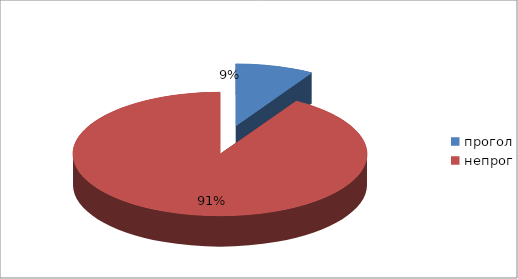
| Category | Series 0 |
|---|---|
| прогол | 36 |
| непрог | 382 |